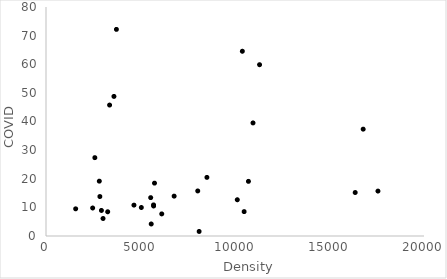
| Category | covid19_viv_mil |
|---|---|
| 3363.8661860585426 | 45.748 |
| 5693.114734211299 | 10.475 |
| 10952.619445296106 | 39.499 |
| 2468.8660946437317 | 9.782 |
| 8514.396550230678 | 20.478 |
| 11299.258440037891 | 59.842 |
| 5690.738124178467 | 10.868 |
| 3726.1061070414407 | 72.185 |
| 16782.067223457067 | 37.33 |
| 1569.7464277188933 | 9.495 |
| 3595.929465322649 | 48.761 |
| 2932.9646089247212 | 8.927 |
| 2821.044835647392 | 19.158 |
| 5568.104169011899 | 4.196 |
| 10482.865595217156 | 8.522 |
| 8028.826608150492 | 15.738 |
| 6124.071487731274 | 7.719 |
| 2584.015213796479 | 27.37 |
| 10121.616782484512 | 12.665 |
| 10711.266807324644 | 19.092 |
| 10388.52952954096 | 64.544 |
| 5044.121451307458 | 9.954 |
| 4654.339484501844 | 10.791 |
| 8102.04659076991 | 1.589 |
| 5538.840374341981 | 13.401 |
| 5740.986236776129 | 18.467 |
| 3017.805162299548 | 6.113 |
| 16359.92447492726 | 15.192 |
| 6779.6057572635755 | 13.92 |
| 2850.338701795857 | 13.789 |
| 17563.99361160582 | 15.698 |
| 3264.8858473749906 | 8.465 |